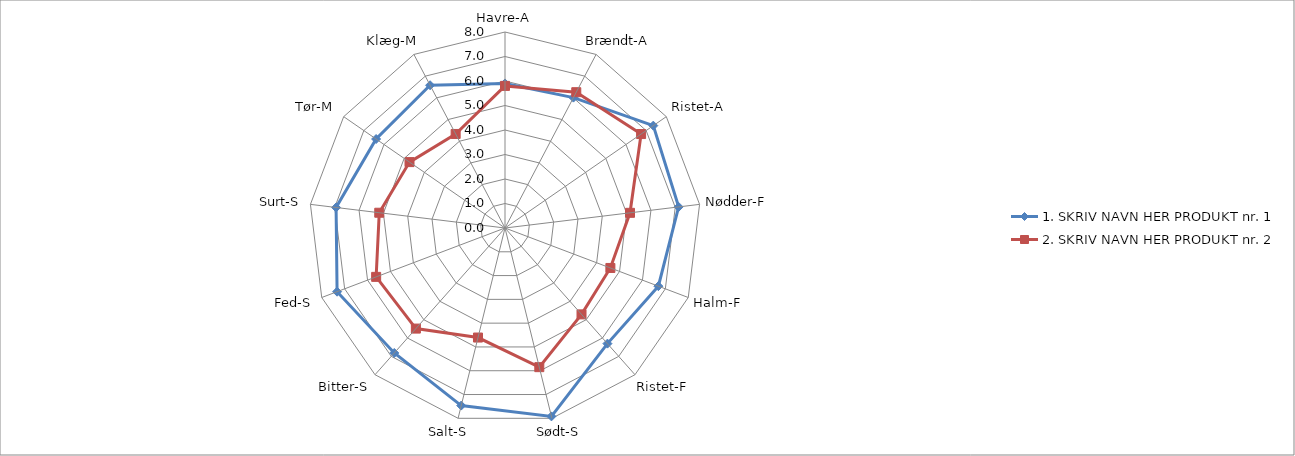
| Category | 1. SKRIV NAVN HER PRODUKT nr. 1 | 2. SKRIV NAVN HER PRODUKT nr. 2 |
|---|---|---|
| Havre-A | 5.9 | 5.8 |
| Brændt-A | 6.01 | 6.26 |
| Ristet-A | 7.355 | 6.75 |
| Nødder-F | 7.14 | 5.14 |
| Halm-F | 6.695 | 4.6 |
| Ristet-F | 6.305 | 4.711 |
| Sødt-S | 7.92 | 5.85 |
| Salt-S | 7.465 | 4.605 |
| Bitter-S | 6.815 | 5.485 |
| Fed-S | 7.33 | 5.625 |
| Surt-S | 6.945 | 5.17 |
| Tør-M | 6.393 | 4.735 |
| Klæg-M | 6.58 | 4.335 |